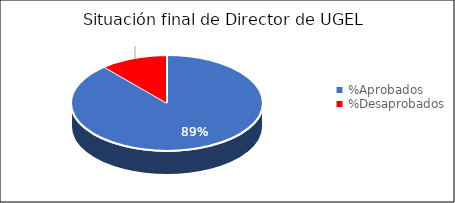
| Category | Series 0 |
|---|---|
| %Aprobados | 0.886 |
| %Desaprobados | 0.114 |